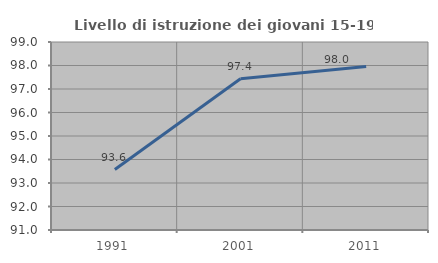
| Category | Livello di istruzione dei giovani 15-19 anni |
|---|---|
| 1991.0 | 93.571 |
| 2001.0 | 97.436 |
| 2011.0 | 97.959 |